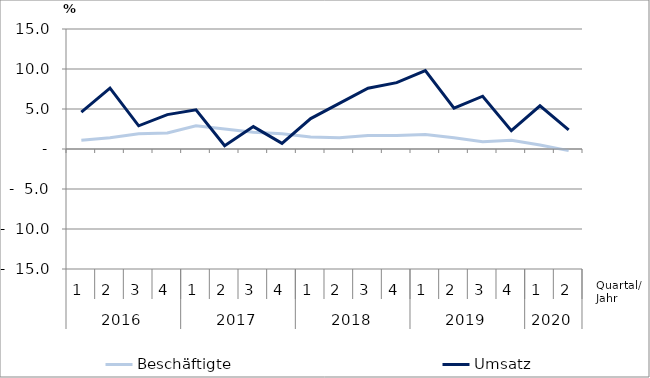
| Category | Beschäftigte | Umsatz |
|---|---|---|
| 0 | 1.1 | 4.6 |
| 1 | 1.4 | 7.6 |
| 2 | 1.9 | 2.9 |
| 3 | 2 | 4.3 |
| 4 | 2.9 | 4.9 |
| 5 | 2.5 | 0.4 |
| 6 | 2.1 | 2.8 |
| 7 | 1.9 | 0.7 |
| 8 | 1.5 | 3.8 |
| 9 | 1.4 | 5.7 |
| 10 | 1.7 | 7.6 |
| 11 | 1.7 | 8.3 |
| 12 | 1.8 | 9.8 |
| 13 | 1.4 | 5.1 |
| 14 | 0.9 | 6.6 |
| 15 | 1.1 | 2.3 |
| 16 | 0.5 | 5.4 |
| 17 | -0.2 | 2.4 |